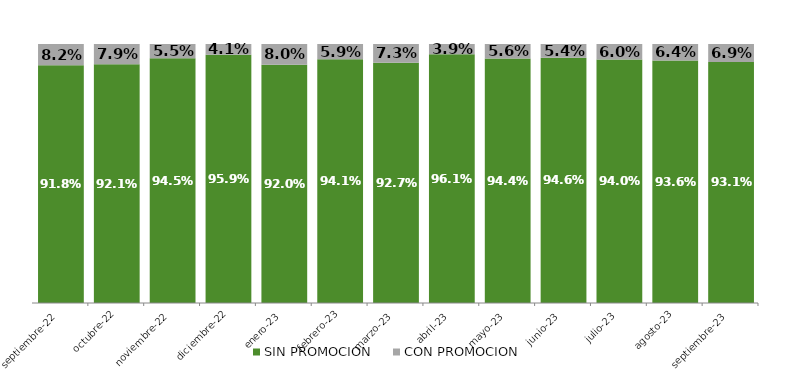
| Category | SIN PROMOCION   | CON PROMOCION   |
|---|---|---|
| 2022-09-01 | 0.918 | 0.082 |
| 2022-10-01 | 0.921 | 0.079 |
| 2022-11-01 | 0.945 | 0.055 |
| 2022-12-01 | 0.959 | 0.041 |
| 2023-01-01 | 0.92 | 0.08 |
| 2023-02-01 | 0.941 | 0.059 |
| 2023-03-01 | 0.927 | 0.073 |
| 2023-04-01 | 0.961 | 0.039 |
| 2023-05-01 | 0.944 | 0.056 |
| 2023-06-01 | 0.946 | 0.054 |
| 2023-07-01 | 0.94 | 0.06 |
| 2023-08-01 | 0.936 | 0.064 |
| 2023-09-01 | 0.931 | 0.069 |